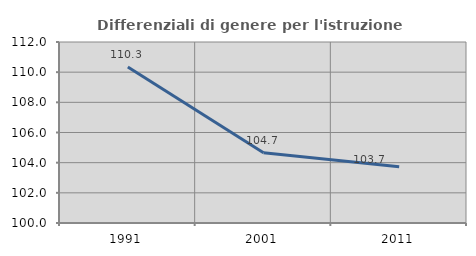
| Category | Differenziali di genere per l'istruzione superiore |
|---|---|
| 1991.0 | 110.348 |
| 2001.0 | 104.659 |
| 2011.0 | 103.724 |